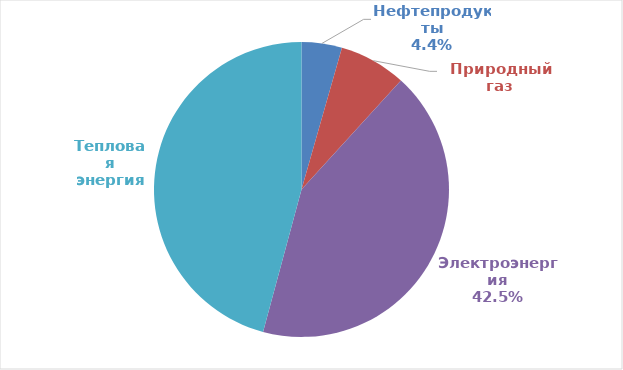
| Category | Series 0 |
|---|---|
| Нефтепродукты | 7032.2 |
| Природный газ | 11677.8 |
| Прочие виды твердого топлива | 0 |
| Электроэнергия | 67434.8 |
| Тепловая энергия | 72792.4 |